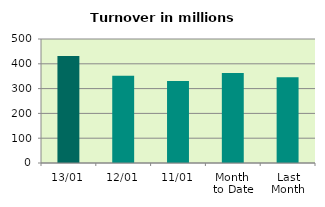
| Category | Series 0 |
|---|---|
| 13/01 | 431.502 |
| 12/01 | 352.235 |
| 11/01 | 330.162 |
| Month 
to Date | 362.637 |
| Last
Month | 346.191 |